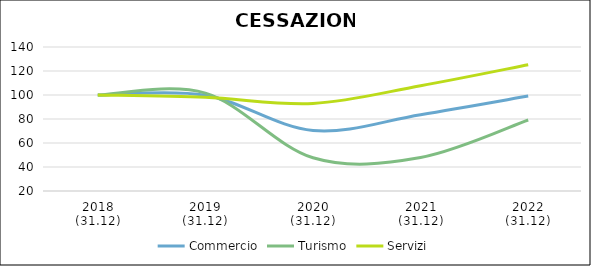
| Category | Commercio | Turismo | Servizi |
|---|---|---|---|
| 2018
(31.12) | 100 | 100 | 100 |
| 2019
(31.12) | 99.792 | 101.605 | 98.103 |
| 2020
(31.12) | 70.374 | 47.674 | 92.933 |
| 2021
(31.12) | 83.63 | 47.894 | 107.712 |
| 2022
(31.12) | 99.12 | 79.134 | 125.192 |